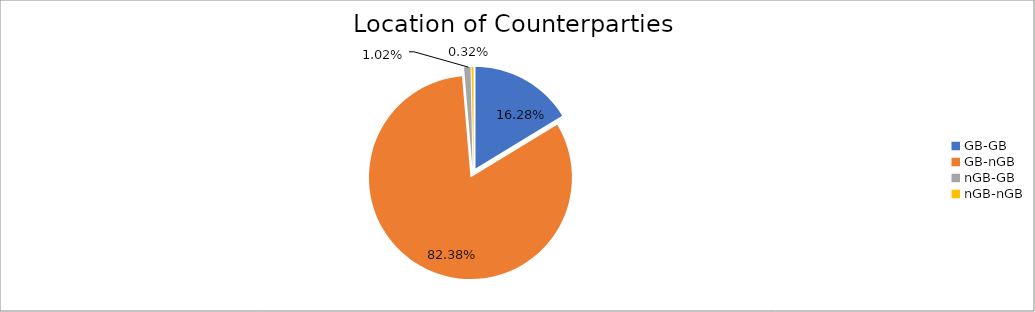
| Category | Series 0 |
|---|---|
| GB-GB | 1590765.358 |
| GB-nGB | 8047896.871 |
| nGB-GB | 99434.365 |
| nGB-nGB | 30800.433 |